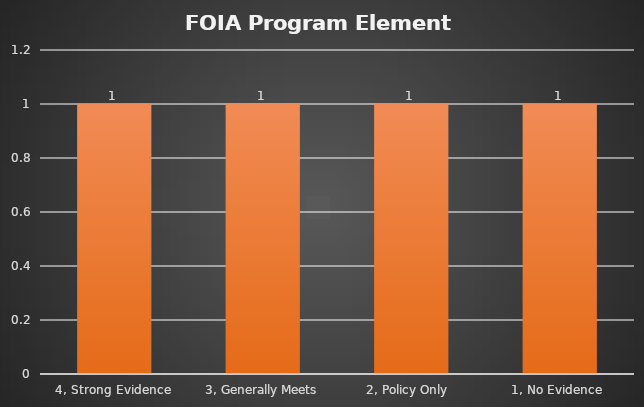
| Category | Total Count |
|---|---|
| 4, Strong Evidence | 1 |
| 3, Generally Meets | 1 |
| 2, Policy Only  | 1 |
| 1, No Evidence  | 1 |